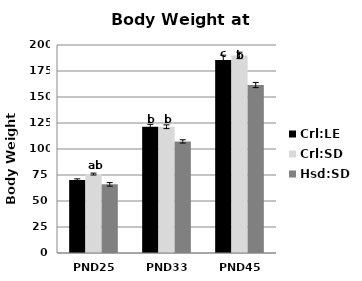
| Category | Crl:LE | Crl:SD | Hsd:SD |
|---|---|---|---|
| PND25 | 70.2 | 75.9 | 66 |
| PND33 | 121.3 | 121.4 | 107.3 |
| PND45 | 185.6 | 190 | 161.5 |